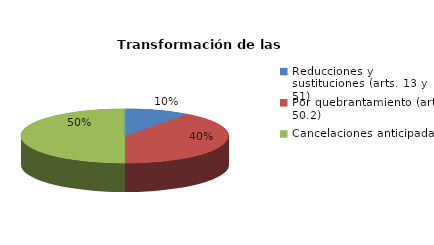
| Category | Series 0 |
|---|---|
| Reducciones y sustituciones (arts. 13 y 51) | 4 |
| Por quebrantamiento (art. 50.2) | 16 |
| Cancelaciones anticipadas | 20 |
| Traslado a Centros Penitenciarios | 0 |
| Conversión internamientos en cerrados (art. 51.2) | 0 |